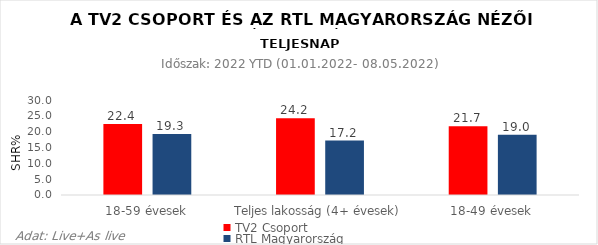
| Category | TV2 Csoport | RTL Magyarország |
|---|---|---|
| 18-59 évesek | 22.4 | 19.3 |
| Teljes lakosság (4+ évesek) | 24.2 | 17.2 |
| 18-49 évesek | 21.7 | 19 |